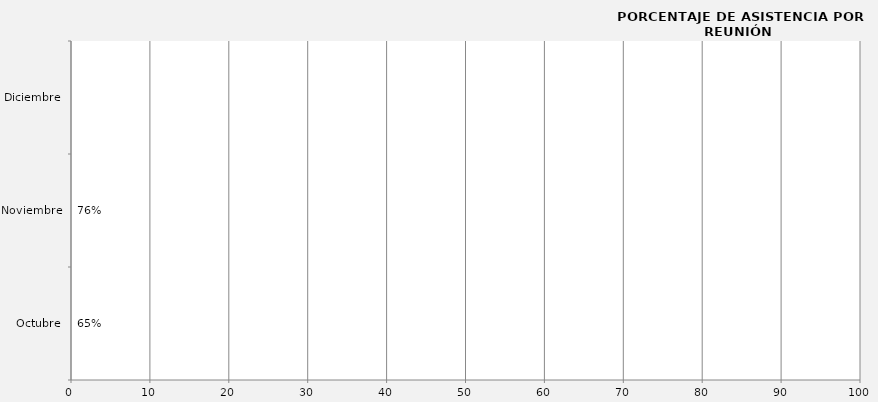
| Category | Series 0 |
|---|---|
| Octubre | 0 |
| Noviembre | 0 |
| Diciembre | 0 |